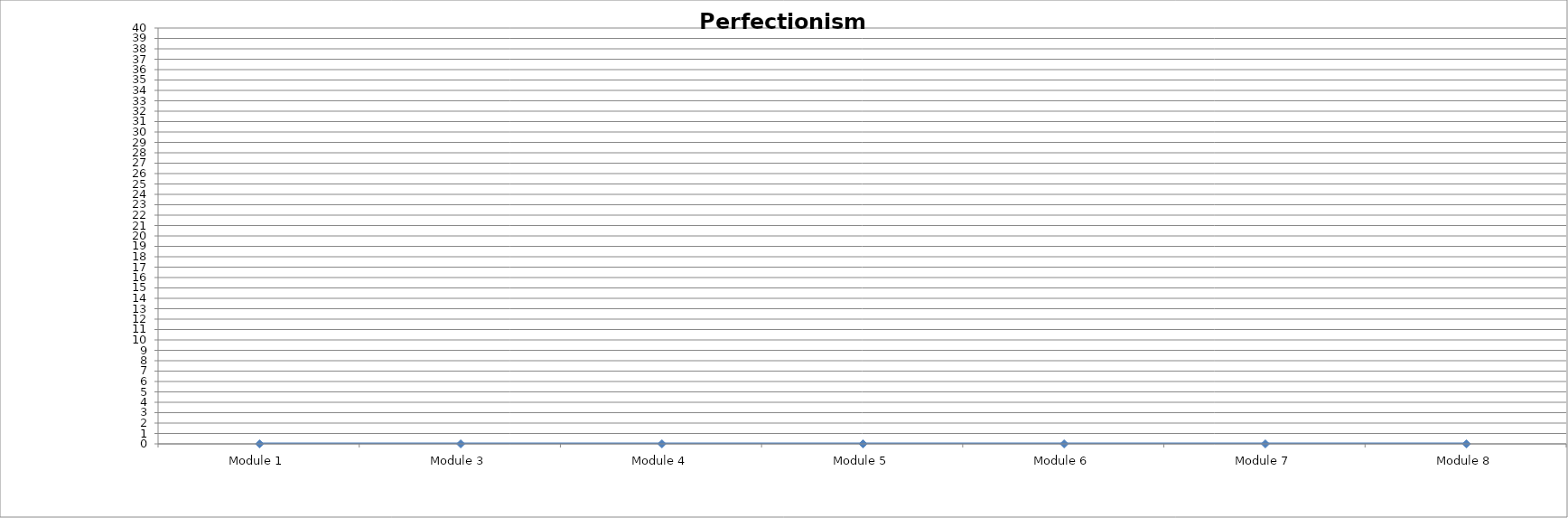
| Category | Series 0 |
|---|---|
| Module 1 | 0 |
| Module 3 | 0 |
| Module 4 | 0 |
| Module 5 | 0 |
| Module 6 | 0 |
| Module 7 | 0 |
| Module 8 | 0 |